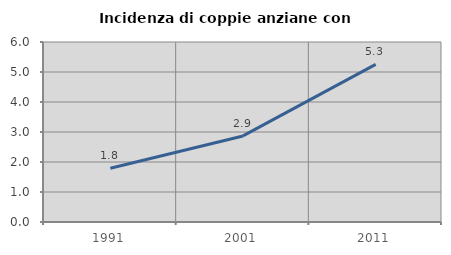
| Category | Incidenza di coppie anziane con figli |
|---|---|
| 1991.0 | 1.791 |
| 2001.0 | 2.869 |
| 2011.0 | 5.256 |